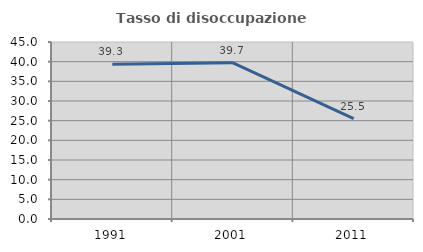
| Category | Tasso di disoccupazione giovanile  |
|---|---|
| 1991.0 | 39.327 |
| 2001.0 | 39.712 |
| 2011.0 | 25.526 |